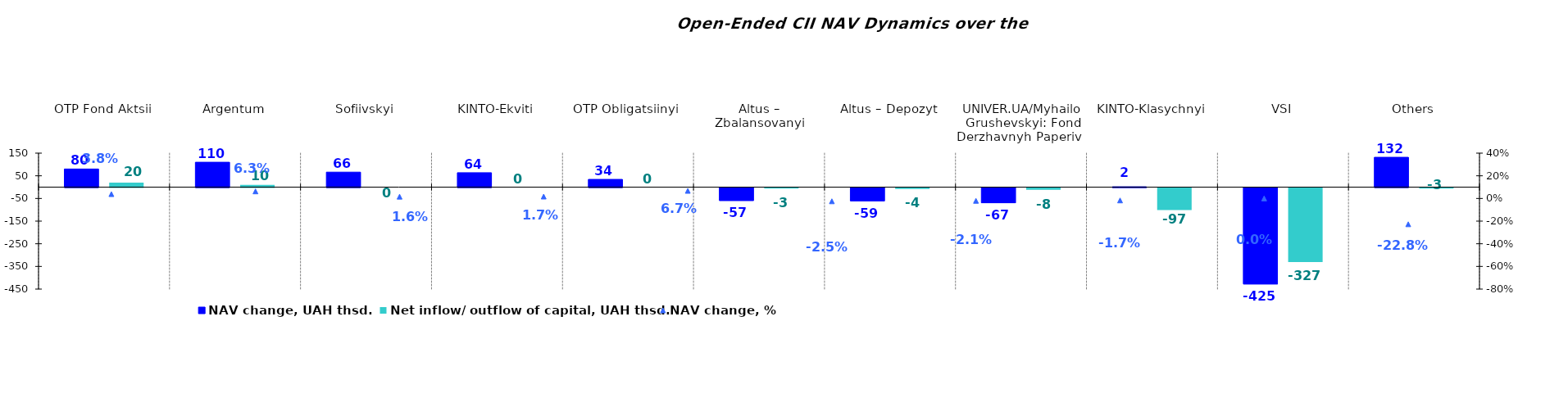
| Category | NAV change, UAH thsd. | Net inflow/ outflow of capital, UAH thsd. |
|---|---|---|
| OTP Fond Aktsii | 80.001 | 20 |
| Argentum | 109.843 | 9.884 |
| Sofiivskyi | 66.132 | 0 |
| KINTO-Ekviti | 63.645 | 0 |
| OTP Obligatsiinyi  | 34.125 | 0 |
| Altus – Zbalansovanyi | -57.226 | -3.068 |
| Altus – Depozyt | -58.711 | -4.388 |
| UNIVER.UA/Myhailo Grushevskyi: Fond Derzhavnyh Paperiv    | -67.223 | -8.263 |
| KINTO-Klasychnyi | 1.69 | -97.282 |
| VSI | -425.475 | -326.839 |
| Others | 131.7 | -2.859 |